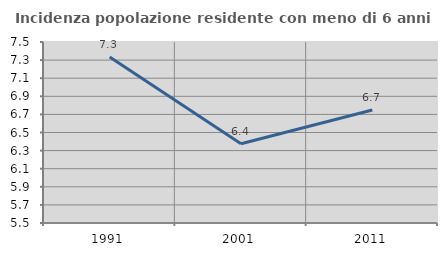
| Category | Incidenza popolazione residente con meno di 6 anni |
|---|---|
| 1991.0 | 7.334 |
| 2001.0 | 6.376 |
| 2011.0 | 6.748 |